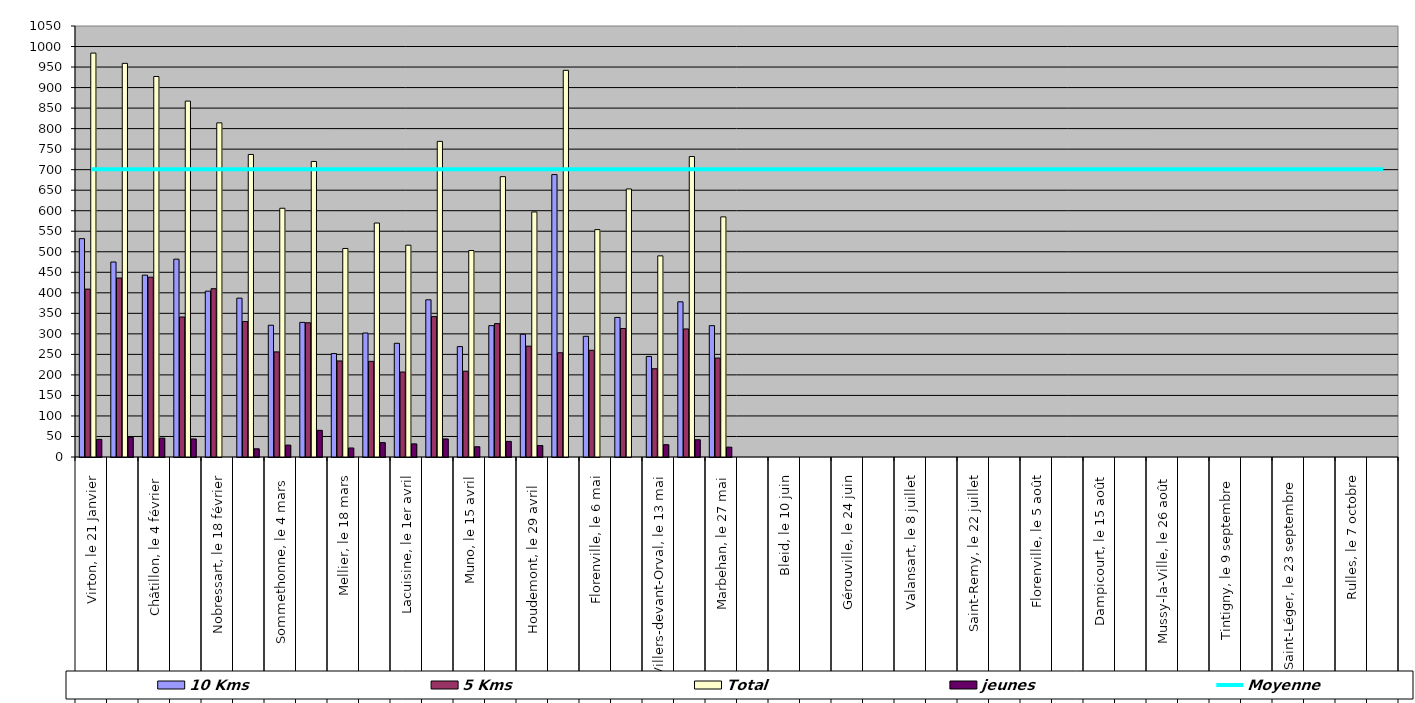
| Category | 10 Kms | 5 Kms | Total | jeunes |
|---|---|---|---|---|
| 0 | 532 | 409 | 984 | 43 |
| 1 | 475 | 436 | 959 | 48 |
| 2 | 443 | 438 | 927 | 46 |
| 3 | 482 | 341 | 867 | 44 |
| 4 | 404 | 410 | 814 | 0 |
| 5 | 387 | 330 | 737 | 20 |
| 6 | 321 | 256 | 606 | 29 |
| 7 | 328 | 327 | 720 | 65 |
| 8 | 252 | 234 | 508 | 22 |
| 9 | 302 | 233 | 570 | 35 |
| 10 | 277 | 207 | 516 | 32 |
| 11 | 383 | 342 | 769 | 44 |
| 12 | 269 | 209 | 503 | 25 |
| 13 | 320 | 325 | 683 | 38 |
| 14 | 299 | 270 | 597 | 28 |
| 15 | 688 | 254 | 942 | 0 |
| 16 | 294 | 260 | 554 | 0 |
| 17 | 340 | 313 | 653 | 0 |
| 18 | 245 | 215 | 490 | 30 |
| 19 | 378 | 312 | 732 | 42 |
| 20 | 320 | 241 | 585 | 24 |
| 21 | 0 | 0 | 0 | 0 |
| 22 | 0 | 0 | 0 | 0 |
| 23 | 0 | 0 | 0 | 0 |
| 24 | 0 | 0 | 0 | 0 |
| 25 | 0 | 0 | 0 | 0 |
| 26 | 0 | 0 | 0 | 0 |
| 27 | 0 | 0 | 0 | 0 |
| 28 | 0 | 0 | 0 | 0 |
| 29 | 0 | 0 | 0 | 0 |
| 30 | 0 | 0 | 0 | 0 |
| 31 | 0 | 0 | 0 | 0 |
| 32 | 0 | 0 | 0 | 0 |
| 33 | 0 | 0 | 0 | 0 |
| 34 | 0 | 0 | 0 | 0 |
| 35 | 0 | 0 | 0 | 0 |
| 36 | 0 | 0 | 0 | 0 |
| 37 | 0 | 0 | 0 | 0 |
| 38 | 0 | 0 | 0 | 0 |
| 39 | 0 | 0 | 0 | 0 |
| 40 | 0 | 0 | 0 | 0 |
| 41 | 0 | 0 | 0 | 0 |